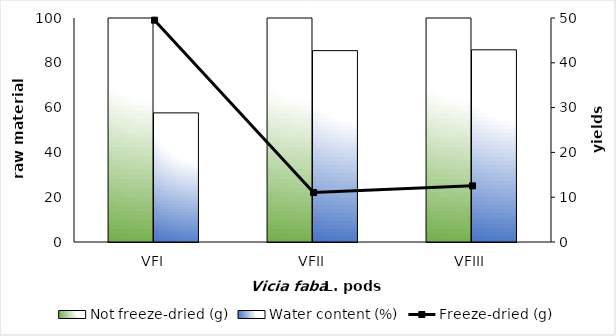
| Category | Not freeze-dried (g) | Water content (%) |
|---|---|---|
| VFI | 100 | 57.64 |
| VFII | 100 | 85.43 |
| VFIII | 100 | 85.8 |